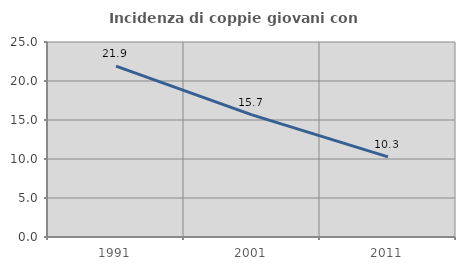
| Category | Incidenza di coppie giovani con figli |
|---|---|
| 1991.0 | 21.909 |
| 2001.0 | 15.663 |
| 2011.0 | 10.277 |